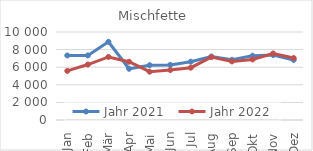
| Category | Jahr 2021 | Jahr 2022 |
|---|---|---|
| Jan | 7334 | 5579 |
| Feb | 7342 | 6302 |
| Mär | 8889 | 7165 |
| Apr | 5822 | 6621 |
| Mai | 6226 | 5486 |
| Jun | 6263 | 5679 |
| Jul | 6626 | 5945 |
| Aug | 7218 | 7145 |
| Sep | 6842 | 6656 |
| Okt | 7304 | 6878 |
| Nov | 7386 | 7558 |
| Dez | 6826 | 7041 |